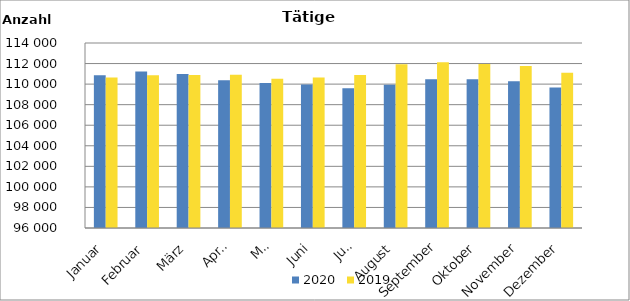
| Category | 2020 | 2019 |
|---|---|---|
| Januar | 110859 | 110645 |
| Februar | 111228 | 110871 |
| März | 110989 | 110887 |
| April | 110380 | 110901 |
| Mai | 110108 | 110525 |
| Juni | 109970 | 110634 |
| Juli | 109599 | 110882 |
| August | 109934 | 111928 |
| September | 110465 | 112126 |
| Oktober | 110479 | 111945 |
| November | 110278 | 111771 |
| Dezember | 109666 | 111097 |